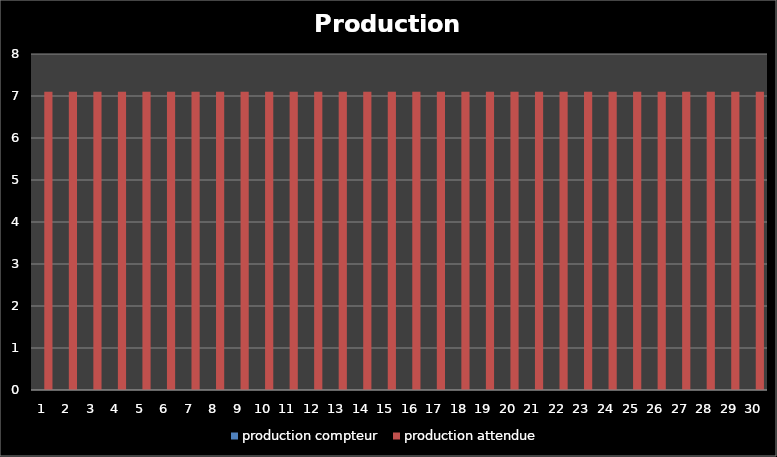
| Category | production compteur | production attendue |
|---|---|---|
| 1.0 | 0 | 7.1 |
| 2.0 | 0 | 7.1 |
| 3.0 | 0 | 7.1 |
| 4.0 | 0 | 7.1 |
| 5.0 | 0 | 7.1 |
| 6.0 | 0 | 7.1 |
| 7.0 | 0 | 7.1 |
| 8.0 | 0 | 7.1 |
| 9.0 | 0 | 7.1 |
| 10.0 | 0 | 7.1 |
| 11.0 | 0 | 7.1 |
| 12.0 | 0 | 7.1 |
| 13.0 | 0 | 7.1 |
| 14.0 | 0 | 7.1 |
| 15.0 | 0 | 7.1 |
| 16.0 | 0 | 7.1 |
| 17.0 | 0 | 7.1 |
| 18.0 | 0 | 7.1 |
| 19.0 | 0 | 7.1 |
| 20.0 | 0 | 7.1 |
| 21.0 | 0 | 7.1 |
| 22.0 | 0 | 7.1 |
| 23.0 | 0 | 7.1 |
| 24.0 | 0 | 7.1 |
| 25.0 | 0 | 7.1 |
| 26.0 | 0 | 7.1 |
| 27.0 | 0 | 7.1 |
| 28.0 | 0 | 7.1 |
| 29.0 | 0 | 7.1 |
| 30.0 | 0 | 7.1 |